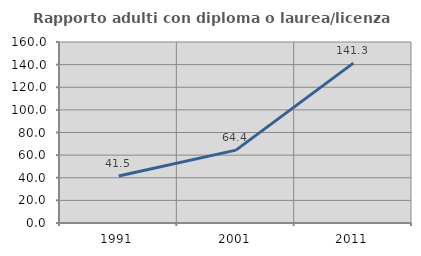
| Category | Rapporto adulti con diploma o laurea/licenza media  |
|---|---|
| 1991.0 | 41.503 |
| 2001.0 | 64.414 |
| 2011.0 | 141.337 |